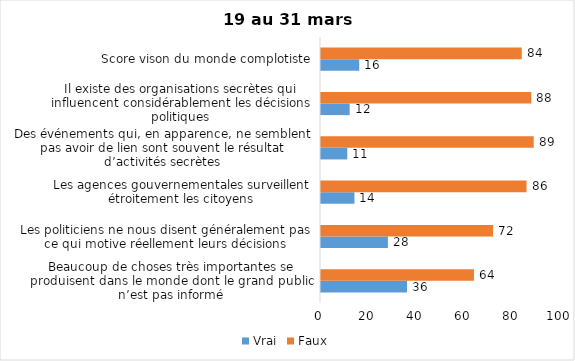
| Category | Vrai | Faux |
|---|---|---|
| Beaucoup de choses très importantes se produisent dans le monde dont le grand public n’est pas informé | 36 | 64 |
| Les politiciens ne nous disent généralement pas ce qui motive réellement leurs décisions | 28 | 72 |
| Les agences gouvernementales surveillent étroitement les citoyens | 14 | 86 |
| Des événements qui, en apparence, ne semblent pas avoir de lien sont souvent le résultat d’activités secrètes | 11 | 89 |
| Il existe des organisations secrètes qui influencent considérablement les décisions politiques | 12 | 88 |
| Score vison du monde complotiste | 16 | 84 |